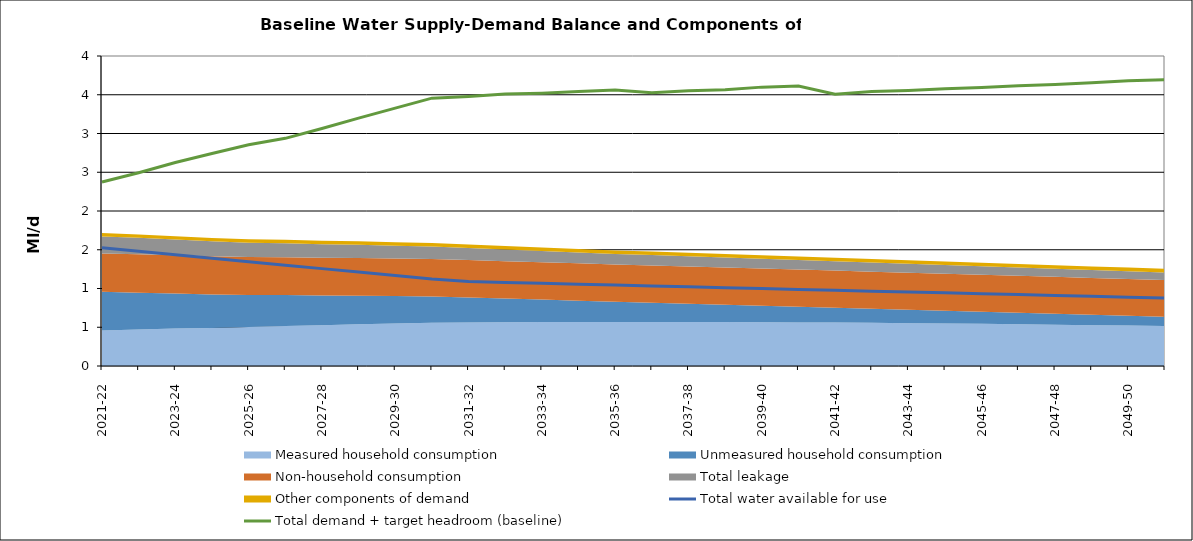
| Category | Total water available for use | Total demand + target headroom (baseline) |
|---|---|---|
| 2020-21 | 1.524 | 2.375 |
| 2021-22 | 1.48 | 2.495 |
| 2022-23 | 1.435 | 2.625 |
| 2023-24 | 1.39 | 2.742 |
| 2024-25 | 1.346 | 2.855 |
| 2025-26 | 1.301 | 2.938 |
| 2026-27 | 1.256 | 3.065 |
| 2027-28 | 1.212 | 3.198 |
| 2028-29 | 1.167 | 3.327 |
| 2029-30 | 1.122 | 3.456 |
| 2030-31 | 1.089 | 3.478 |
| 2031-32 | 1.078 | 3.509 |
| 2032-33 | 1.066 | 3.52 |
| 2033-34 | 1.055 | 3.541 |
| 2034-35 | 1.044 | 3.562 |
| 2035-36 | 1.033 | 3.526 |
| 2036-37 | 1.022 | 3.55 |
| 2037-38 | 1.011 | 3.564 |
| 2038-39 | 0.999 | 3.598 |
| 2039-40 | 0.988 | 3.612 |
| 2040-41 | 0.977 | 3.507 |
| 2041-42 | 0.966 | 3.541 |
| 2042-43 | 0.955 | 3.555 |
| 2043-44 | 0.944 | 3.579 |
| 2044-45 | 0.932 | 3.593 |
| 2045-46 | 0.921 | 3.617 |
| 2046-47 | 0.91 | 3.631 |
| 2047-48 | 0.899 | 3.655 |
| 2048-49 | 0.888 | 3.68 |
| 2049-50 | 0.877 | 3.694 |